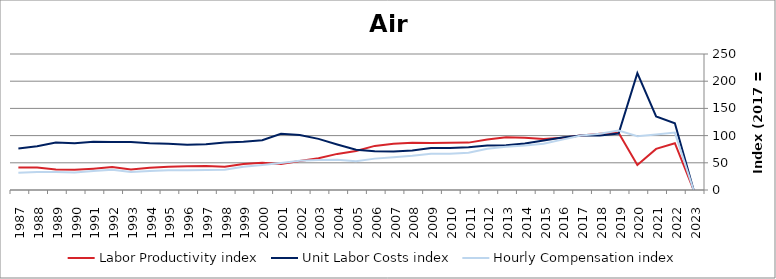
| Category | Labor Productivity index | Unit Labor Costs index | Hourly Compensation index |
|---|---|---|---|
| 2023.0 | 0 | 0 | 0 |
| 2022.0 | 86.01 | 122.7 | 105.534 |
| 2021.0 | 75.537 | 135.131 | 102.074 |
| 2020.0 | 46.048 | 214.88 | 98.949 |
| 2019.0 | 105.268 | 103.821 | 109.291 |
| 2018.0 | 103.197 | 100.27 | 103.475 |
| 2017.0 | 100 | 100 | 100 |
| 2016.0 | 96.07 | 96.371 | 92.583 |
| 2015.0 | 93.555 | 91.092 | 85.222 |
| 2014.0 | 95.948 | 85.364 | 81.905 |
| 2013.0 | 96.922 | 82.169 | 79.64 |
| 2012.0 | 92.631 | 81.84 | 75.809 |
| 2011.0 | 87.1 | 78.505 | 68.378 |
| 2010.0 | 86.652 | 77.148 | 66.85 |
| 2009.0 | 86.216 | 77.282 | 66.629 |
| 2008.0 | 86.668 | 72.521 | 62.852 |
| 2007.0 | 85.055 | 70.775 | 60.198 |
| 2006.0 | 81.062 | 71.144 | 57.67 |
| 2005.0 | 71.649 | 73.877 | 52.932 |
| 2004.0 | 66.377 | 83.623 | 55.506 |
| 2003.0 | 58.499 | 93.95 | 54.96 |
| 2002.0 | 53.112 | 101.066 | 53.678 |
| 2001.0 | 47.914 | 103.215 | 49.455 |
| 2000.0 | 50.11 | 91.6 | 45.901 |
| 1999.0 | 47.963 | 88.666 | 42.527 |
| 1998.0 | 42.604 | 87.228 | 37.163 |
| 1997.0 | 43.898 | 84.255 | 36.986 |
| 1996.0 | 43.715 | 83.395 | 36.456 |
| 1995.0 | 42.667 | 85.025 | 36.278 |
| 1994.0 | 40.846 | 85.783 | 35.039 |
| 1993.0 | 37.708 | 88.124 | 33.23 |
| 1992.0 | 42.083 | 88.465 | 37.229 |
| 1991.0 | 39.269 | 88.782 | 34.864 |
| 1990.0 | 37.18 | 86.16 | 32.034 |
| 1989.0 | 37.886 | 87.352 | 33.094 |
| 1988.0 | 41.179 | 80.331 | 33.08 |
| 1987.0 | 41.276 | 76.309 | 31.497 |